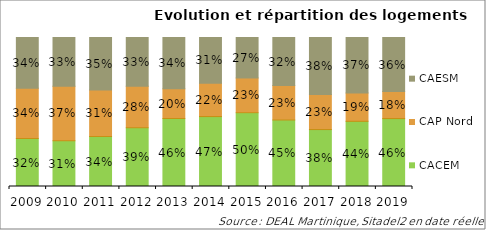
| Category | CACEM | CAP Nord | CAESM |
|---|---|---|---|
| 2009 | 0.322 | 0.338 | 0.34 |
| 2010 | 0.307 | 0.366 | 0.327 |
| 2011 | 0.335 | 0.313 | 0.352 |
| 2012 | 0.394 | 0.278 | 0.328 |
| 2013 | 0.456 | 0.199 | 0.345 |
| 2014 | 0.469 | 0.224 | 0.307 |
| 2015 | 0.495 | 0.233 | 0.272 |
| 2016 | 0.446 | 0.231 | 0.323 |
| 2017 | 0.382 | 0.235 | 0.383 |
| 2018 | 0.437 | 0.19 | 0.372 |
| 2019 | 0.456 | 0.181 | 0.363 |